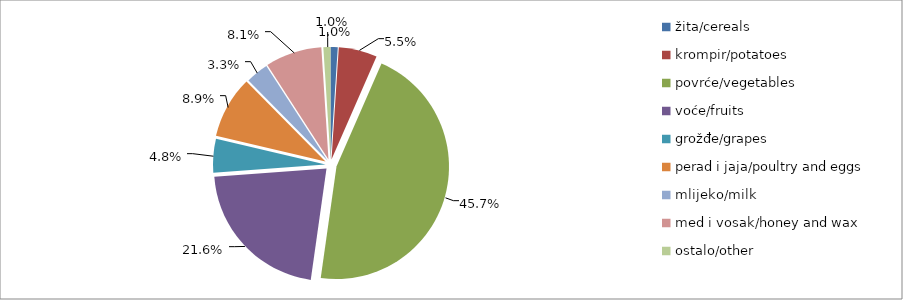
| Category | Series 0 |
|---|---|
| žita/cereals | 19186 |
| krompir/potatoes | 102447 |
| povrće/vegetables | 847951.5 |
| voće/fruits | 400692 |
| grožđe/grapes | 89889 |
| perad i jaja/poultry and eggs | 165789 |
| mlijeko/milk | 60366.5 |
| med i vosak/honey and wax | 150905 |
| ostalo/other | 18850 |